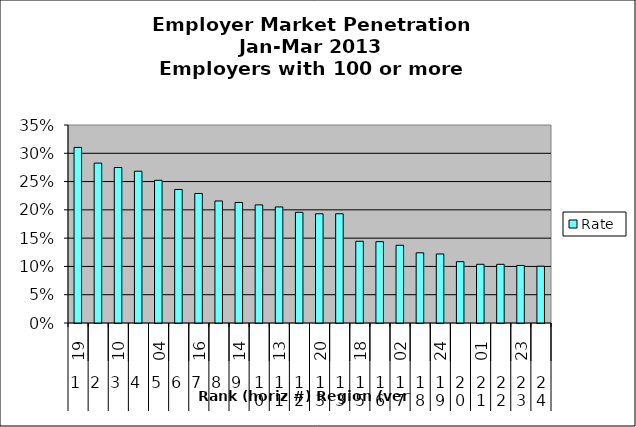
| Category | Rate |
|---|---|
| 0 | 0.31 |
| 1 | 0.283 |
| 2 | 0.275 |
| 3 | 0.268 |
| 4 | 0.252 |
| 5 | 0.236 |
| 6 | 0.229 |
| 7 | 0.216 |
| 8 | 0.213 |
| 9 | 0.209 |
| 10 | 0.205 |
| 11 | 0.196 |
| 12 | 0.193 |
| 13 | 0.193 |
| 14 | 0.144 |
| 15 | 0.144 |
| 16 | 0.137 |
| 17 | 0.124 |
| 18 | 0.122 |
| 19 | 0.108 |
| 20 | 0.104 |
| 21 | 0.104 |
| 22 | 0.102 |
| 23 | 0.1 |